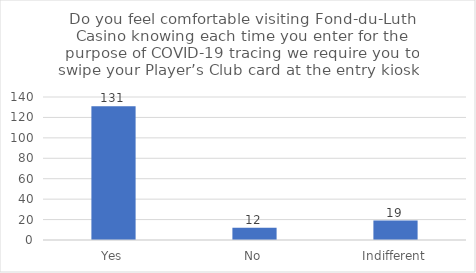
| Category | Series 0 |
|---|---|
| Yes | 131 |
| No | 12 |
| Indifferent | 19 |